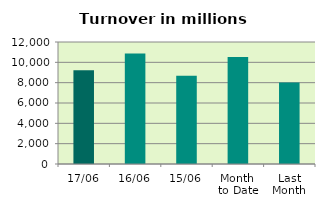
| Category | Series 0 |
|---|---|
| 17/06 | 9216.752 |
| 16/06 | 10862.923 |
| 15/06 | 8677.58 |
| Month 
to Date | 10516.89 |
| Last
Month | 8023.22 |